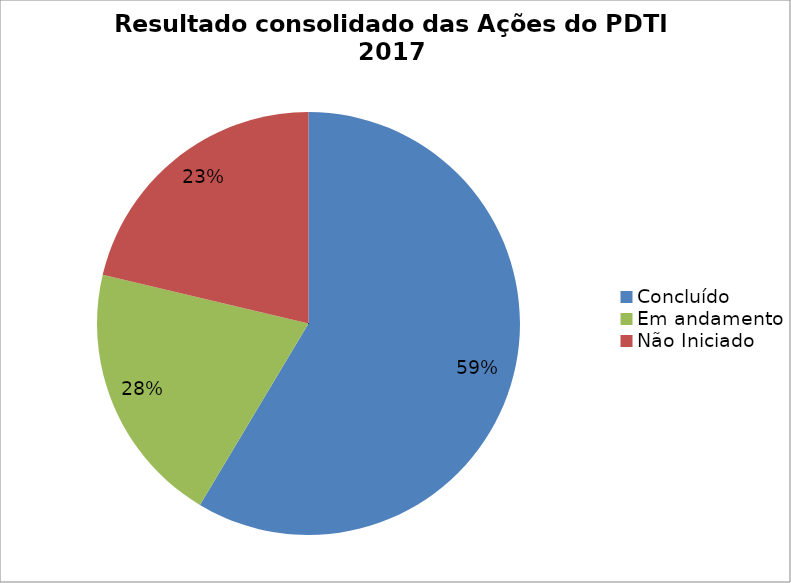
| Category | Series 0 |
|---|---|
| Concluído | 0.586 |
| Em andamento | 0.201 |
| Não Iniciado | 0.213 |